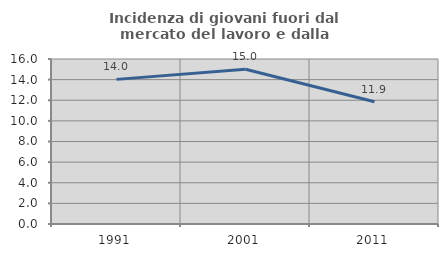
| Category | Incidenza di giovani fuori dal mercato del lavoro e dalla formazione  |
|---|---|
| 1991.0 | 14.024 |
| 2001.0 | 15 |
| 2011.0 | 11.858 |